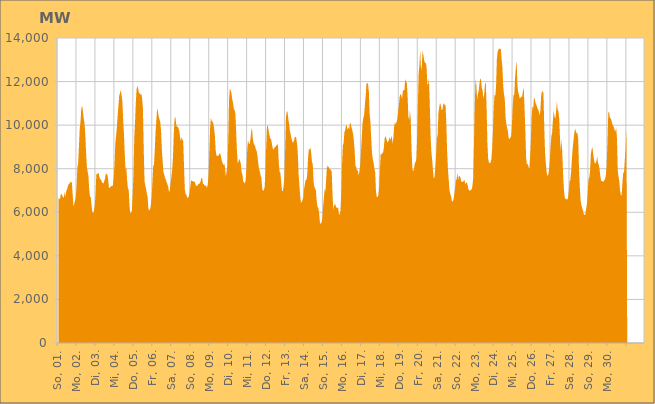
| Category | Series 0 |
|---|---|
|  So, 01.  | 6609.094 |
|  So, 01.  | 6641.879 |
|  So, 01.  | 6589.041 |
|  So, 01.  | 6832.355 |
|  So, 01.  | 6833.887 |
|  So, 01.  | 6762.77 |
|  So, 01.  | 6698.629 |
|  So, 01.  | 6660.672 |
|  So, 01.  | 6949.482 |
|  So, 01.  | 6717.455 |
|  So, 01.  | 6993.082 |
|  So, 01.  | 7049.189 |
|  So, 01.  | 7202.293 |
|  So, 01.  | 7287.182 |
|  So, 01.  | 7312.8 |
|  So, 01.  | 7403.01 |
|  So, 01.  | 7358.183 |
|  Mo, 02.  | 7404.866 |
|  Mo, 02.  | 6848.365 |
|  Mo, 02.  | 6285.724 |
|  Mo, 02.  | 6386.264 |
|  Mo, 02.  | 6525.773 |
|  Mo, 02.  | 6675.253 |
|  Mo, 02.  | 7191.673 |
|  Mo, 02.  | 8045.313 |
|  Mo, 02.  | 8243.904 |
|  Mo, 02.  | 9013.681 |
|  Mo, 02.  | 9832.148 |
|  Mo, 02.  | 10179.757 |
|  Mo, 02.  | 10755.446 |
|  Mo, 02.  | 10888.969 |
|  Mo, 02.  | 10648.476 |
|  Mo, 02.  | 10304.716 |
|  Mo, 02.  | 10105.372 |
|  Mo, 02.  | 9598.46 |
|  Mo, 02.  | 8782.57 |
|  Mo, 02.  | 8084.724 |
|  Mo, 02.  | 7870.404 |
|  Mo, 02.  | 7668.928 |
|  Mo, 02.  | 7055.239 |
|  Mo, 02.  | 6701.512 |
|  Di, 03.  | 6710.743 |
|  Di, 03.  | 6304.086 |
|  Di, 03.  | 5997.291 |
|  Di, 03.  | 5959.956 |
|  Di, 03.  | 6061.653 |
|  Di, 03.  | 6303.941 |
|  Di, 03.  | 6838.596 |
|  Di, 03.  | 7747.436 |
|  Di, 03.  | 7747.659 |
|  Di, 03.  | 7777.552 |
|  Di, 03.  | 7810.3 |
|  Di, 03.  | 7607.157 |
|  Di, 03.  | 7514.668 |
|  Di, 03.  | 7508.314 |
|  Di, 03.  | 7397.384 |
|  Di, 03.  | 7338.894 |
|  Di, 03.  | 7318.414 |
|  Di, 03.  | 7419.01 |
|  Di, 03.  | 7545.15 |
|  Di, 03.  | 7780.058 |
|  Di, 03.  | 7761.892 |
|  Di, 03.  | 7715.73 |
|  Di, 03.  | 7504.461 |
|  Di, 03.  | 7112.614 |
|  Mi, 04.  | 7146.214 |
|  Mi, 04.  | 7159.89 |
|  Mi, 04.  | 7222.329 |
|  Mi, 04.  | 7192.957 |
|  Mi, 04.  | 7249.964 |
|  Mi, 04.  | 7599.159 |
|  Mi, 04.  | 8187.518 |
|  Mi, 04.  | 9152.819 |
|  Mi, 04.  | 9492.616 |
|  Mi, 04.  | 9891.391 |
|  Mi, 04.  | 10433.427 |
|  Mi, 04.  | 10897.175 |
|  Mi, 04.  | 11364.273 |
|  Mi, 04.  | 11476.517 |
|  Mi, 04.  | 11613.148 |
|  Mi, 04.  | 11357.869 |
|  Mi, 04.  | 11064.819 |
|  Mi, 04.  | 10218.077 |
|  Mi, 04.  | 9591.602 |
|  Mi, 04.  | 8676.286 |
|  Mi, 04.  | 7955.344 |
|  Mi, 04.  | 8056.5 |
|  Mi, 04.  | 7460.831 |
|  Mi, 04.  | 7093.16 |
|  Do, 05.  | 7035.402 |
|  Do, 05.  | 6301.559 |
|  Do, 05.  | 5948.114 |
|  Do, 05.  | 5976.624 |
|  Do, 05.  | 6086.227 |
|  Do, 05.  | 6824.893 |
|  Do, 05.  | 7685.257 |
|  Do, 05.  | 9396.837 |
|  Do, 05.  | 10136.279 |
|  Do, 05.  | 11053.049 |
|  Do, 05.  | 11643.505 |
|  Do, 05.  | 11813.227 |
|  Do, 05.  | 11669.072 |
|  Do, 05.  | 11471.2 |
|  Do, 05.  | 11462.873 |
|  Do, 05.  | 11382.948 |
|  Do, 05.  | 11435.166 |
|  Do, 05.  | 11224.291 |
|  Do, 05.  | 10759.338 |
|  Do, 05.  | 8907.942 |
|  Do, 05.  | 7433.535 |
|  Do, 05.  | 7228.24 |
|  Do, 05.  | 7073.832 |
|  Do, 05.  | 6850.962 |
|  Fr, 06.  | 6666.874 |
|  Fr, 06.  | 6133.054 |
|  Fr, 06.  | 6090.807 |
|  Fr, 06.  | 6125.178 |
|  Fr, 06.  | 6318.289 |
|  Fr, 06.  | 6691.272 |
|  Fr, 06.  | 7361.753 |
|  Fr, 06.  | 8127.63 |
|  Fr, 06.  | 8185.358 |
|  Fr, 06.  | 8855.286 |
|  Fr, 06.  | 9684.257 |
|  Fr, 06.  | 10227.416 |
|  Fr, 06.  | 10771.42 |
|  Fr, 06.  | 10629.709 |
|  Fr, 06.  | 10404.634 |
|  Fr, 06.  | 10259.567 |
|  Fr, 06.  | 10127.236 |
|  Fr, 06.  | 9697.392 |
|  Fr, 06.  | 8864.354 |
|  Fr, 06.  | 8331.141 |
|  Fr, 06.  | 7838.08 |
|  Fr, 06.  | 7739.443 |
|  Fr, 06.  | 7568.352 |
|  Fr, 06.  | 7503.322 |
|  Sa, 07.  | 7381.62 |
|  Sa, 07.  | 7279.411 |
|  Sa, 07.  | 7175.44 |
|  Sa, 07.  | 6929.065 |
|  Sa, 07.  | 7002.2 |
|  Sa, 07.  | 7365.982 |
|  Sa, 07.  | 7612.446 |
|  Sa, 07.  | 7934.013 |
|  Sa, 07.  | 8510.626 |
|  Sa, 07.  | 9544.532 |
|  Sa, 07.  | 10298.967 |
|  Sa, 07.  | 10387.305 |
|  Sa, 07.  | 10063.087 |
|  Sa, 07.  | 9922.926 |
|  Sa, 07.  | 9925.384 |
|  Sa, 07.  | 9872.794 |
|  Sa, 07.  | 9739.022 |
|  Sa, 07.  | 9456.034 |
|  Sa, 07.  | 9269.18 |
|  Sa, 07.  | 9448.577 |
|  Sa, 07.  | 9328.712 |
|  Sa, 07.  | 9270.811 |
|  Sa, 07.  | 8142.587 |
|  Sa, 07.  | 7060.627 |
|  So, 08.  | 6831.023 |
|  So, 08.  | 6810.327 |
|  So, 08.  | 6667.015 |
|  So, 08.  | 6669.857 |
|  So, 08.  | 6736.744 |
|  So, 08.  | 6895.374 |
|  So, 08.  | 7193.551 |
|  So, 08.  | 7473.14 |
|  So, 08.  | 7441.878 |
|  So, 08.  | 7426.467 |
|  So, 08.  | 7410.17 |
|  So, 08.  | 7420.375 |
|  So, 08.  | 7345.097 |
|  So, 08.  | 7228.693 |
|  So, 08.  | 7211.187 |
|  So, 08.  | 7218.008 |
|  So, 08.  | 7297.855 |
|  So, 08.  | 7306.649 |
|  So, 08.  | 7327.717 |
|  So, 08.  | 7416.197 |
|  So, 08.  | 7561.046 |
|  So, 08.  | 7579.414 |
|  So, 08.  | 7301.562 |
|  So, 08.  | 7297.466 |
|  Mo, 09.  | 7233.325 |
|  Mo, 09.  | 7213.271 |
|  Mo, 09.  | 7235.511 |
|  Mo, 09.  | 7109.438 |
|  Mo, 09.  | 7267.516 |
|  Mo, 09.  | 7666.855 |
|  Mo, 09.  | 8686.072 |
|  Mo, 09.  | 9841.873 |
|  Mo, 09.  | 10323.79 |
|  Mo, 09.  | 10198.892 |
|  Mo, 09.  | 10171.399 |
|  Mo, 09.  | 10081.609 |
|  Mo, 09.  | 9880.787 |
|  Mo, 09.  | 9549.203 |
|  Mo, 09.  | 8874.469 |
|  Mo, 09.  | 8615.406 |
|  Mo, 09.  | 8582.654 |
|  Mo, 09.  | 8611.158 |
|  Mo, 09.  | 8605.643 |
|  Mo, 09.  | 8708.947 |
|  Mo, 09.  | 8693.62 |
|  Mo, 09.  | 8522.649 |
|  Mo, 09.  | 8348.066 |
|  Mo, 09.  | 8246.385 |
|  Di, 10.  | 8167.295 |
|  Di, 10.  | 8249.138 |
|  Di, 10.  | 8008.505 |
|  Di, 10.  | 7638.507 |
|  Di, 10.  | 7905.795 |
|  Di, 10.  | 8158.52 |
|  Di, 10.  | 9292.214 |
|  Di, 10.  | 11158.01 |
|  Di, 10.  | 11675.636 |
|  Di, 10.  | 11604.006 |
|  Di, 10.  | 11472.156 |
|  Di, 10.  | 11201.858 |
|  Di, 10.  | 11027.963 |
|  Di, 10.  | 10759.568 |
|  Di, 10.  | 10695.582 |
|  Di, 10.  | 10537.319 |
|  Di, 10.  | 9704.477 |
|  Di, 10.  | 8808.77 |
|  Di, 10.  | 8238.538 |
|  Di, 10.  | 8333.451 |
|  Di, 10.  | 8449.541 |
|  Di, 10.  | 8368.532 |
|  Di, 10.  | 8201.718 |
|  Di, 10.  | 7819.59 |
|  Mi, 11.  | 7733.255 |
|  Mi, 11.  | 7388.233 |
|  Mi, 11.  | 7388.447 |
|  Mi, 11.  | 7315.009 |
|  Mi, 11.  | 7468.095 |
|  Mi, 11.  | 7983.67 |
|  Mi, 11.  | 8863.187 |
|  Mi, 11.  | 9308.732 |
|  Mi, 11.  | 9166.52 |
|  Mi, 11.  | 9130.114 |
|  Mi, 11.  | 9317.86 |
|  Mi, 11.  | 9707.588 |
|  Mi, 11.  | 9878.121 |
|  Mi, 11.  | 9402.848 |
|  Mi, 11.  | 9181.781 |
|  Mi, 11.  | 9106.387 |
|  Mi, 11.  | 9024.455 |
|  Mi, 11.  | 8885.106 |
|  Mi, 11.  | 8806.042 |
|  Mi, 11.  | 8591.221 |
|  Mi, 11.  | 8223.411 |
|  Mi, 11.  | 7987.274 |
|  Mi, 11.  | 7868.177 |
|  Mi, 11.  | 7692.864 |
|  Do, 12.  | 7558.308 |
|  Do, 12.  | 7062.089 |
|  Do, 12.  | 6991.603 |
|  Do, 12.  | 7004.928 |
|  Do, 12.  | 7164.059 |
|  Do, 12.  | 7768.196 |
|  Do, 12.  | 8969.397 |
|  Do, 12.  | 9943.696 |
|  Do, 12.  | 9991.874 |
|  Do, 12.  | 9772.303 |
|  Do, 12.  | 9570.866 |
|  Do, 12.  | 9379.636 |
|  Do, 12.  | 9391.888 |
|  Do, 12.  | 9214 |
|  Do, 12.  | 8980.487 |
|  Do, 12.  | 8869.546 |
|  Do, 12.  | 8925.078 |
|  Do, 12.  | 9013.467 |
|  Do, 12.  | 9000.202 |
|  Do, 12.  | 9071.232 |
|  Do, 12.  | 9142.538 |
|  Do, 12.  | 9031.294 |
|  Do, 12.  | 8244.901 |
|  Do, 12.  | 7856.887 |
|  Fr, 13.  | 7810.709 |
|  Fr, 13.  | 7392.71 |
|  Fr, 13.  | 6983.135 |
|  Fr, 13.  | 6962.119 |
|  Fr, 13.  | 7179.709 |
|  Fr, 13.  | 7546.224 |
|  Fr, 13.  | 8861.959 |
|  Fr, 13.  | 10336.063 |
|  Fr, 13.  | 10618.018 |
|  Fr, 13.  | 10624.238 |
|  Fr, 13.  | 10288.395 |
|  Fr, 13.  | 10052.486 |
|  Fr, 13.  | 9745.675 |
|  Fr, 13.  | 9574.057 |
|  Fr, 13.  | 9391.955 |
|  Fr, 13.  | 9259.172 |
|  Fr, 13.  | 9176.535 |
|  Fr, 13.  | 9279.239 |
|  Fr, 13.  | 9423.63 |
|  Fr, 13.  | 9472.029 |
|  Fr, 13.  | 9419.938 |
|  Fr, 13.  | 9159.669 |
|  Fr, 13.  | 8752.281 |
|  Fr, 13.  | 7761.531 |
|  Sa, 14.  | 7258.843 |
|  Sa, 14.  | 6761.795 |
|  Sa, 14.  | 6437.283 |
|  Sa, 14.  | 6471.224 |
|  Sa, 14.  | 6574.562 |
|  Sa, 14.  | 6672.056 |
|  Sa, 14.  | 7082.696 |
|  Sa, 14.  | 7285.042 |
|  Sa, 14.  | 7504.715 |
|  Sa, 14.  | 7481.661 |
|  Sa, 14.  | 7721.218 |
|  Sa, 14.  | 8498.85 |
|  Sa, 14.  | 8900.658 |
|  Sa, 14.  | 8882.47 |
|  Sa, 14.  | 8976.453 |
|  Sa, 14.  | 8699.534 |
|  Sa, 14.  | 8311.743 |
|  Sa, 14.  | 8213.525 |
|  Sa, 14.  | 7401.515 |
|  Sa, 14.  | 7177.583 |
|  Sa, 14.  | 7088.254 |
|  Sa, 14.  | 6995.097 |
|  Sa, 14.  | 6490.657 |
|  Sa, 14.  | 6233.6 |
|  So, 15.  | 6207.485 |
|  So, 15.  | 5969.498 |
|  So, 15.  | 5547.436 |
|  So, 15.  | 5457.16 |
|  So, 15.  | 5541.702 |
|  So, 15.  | 5678.611 |
|  So, 15.  | 6241.343 |
|  So, 15.  | 6652.95 |
|  So, 15.  | 7067.227 |
|  So, 15.  | 6970.18 |
|  So, 15.  | 7526.153 |
|  So, 15.  | 8190.876 |
|  So, 15.  | 8043.724 |
|  So, 15.  | 8099.363 |
|  So, 15.  | 8001.663 |
|  So, 15.  | 7970.38 |
|  So, 15.  | 7938.242 |
|  So, 15.  | 7851.882 |
|  So, 15.  | 6806.599 |
|  So, 15.  | 6114.643 |
|  So, 15.  | 6301.266 |
|  So, 15.  | 6388.752 |
|  So, 15.  | 6301.116 |
|  So, 15.  | 6210.279 |
|  Mo, 16.  | 6195.017 |
|  Mo, 16.  | 6229.172 |
|  Mo, 16.  | 5920.499 |
|  Mo, 16.  | 5895.18 |
|  Mo, 16.  | 6048.652 |
|  Mo, 16.  | 6760.607 |
|  Mo, 16.  | 8157.974 |
|  Mo, 16.  | 9068.661 |
|  Mo, 16.  | 9171.472 |
|  Mo, 16.  | 9676.342 |
|  Mo, 16.  | 9768.978 |
|  Mo, 16.  | 9982.692 |
|  Mo, 16.  | 9993.698 |
|  Mo, 16.  | 9779.546 |
|  Mo, 16.  | 9907.58 |
|  Mo, 16.  | 9816.579 |
|  Mo, 16.  | 10071.717 |
|  Mo, 16.  | 10102.772 |
|  Mo, 16.  | 9889.757 |
|  Mo, 16.  | 9771.211 |
|  Mo, 16.  | 9582.563 |
|  Mo, 16.  | 9293.962 |
|  Mo, 16.  | 8824.165 |
|  Mo, 16.  | 8123.477 |
|  Di, 17.  | 8066.436 |
|  Di, 17.  | 7915.646 |
|  Di, 17.  | 7939.034 |
|  Di, 17.  | 7698.632 |
|  Di, 17.  | 7880.009 |
|  Di, 17.  | 8174.907 |
|  Di, 17.  | 8758.577 |
|  Di, 17.  | 9471.181 |
|  Di, 17.  | 10103.226 |
|  Di, 17.  | 10333.484 |
|  Di, 17.  | 10485.845 |
|  Di, 17.  | 10974.1 |
|  Di, 17.  | 11346.165 |
|  Di, 17.  | 11926.562 |
|  Di, 17.  | 11936.308 |
|  Di, 17.  | 11866.894 |
|  Di, 17.  | 11522.956 |
|  Di, 17.  | 10487.472 |
|  Di, 17.  | 10125.622 |
|  Di, 17.  | 9364.838 |
|  Di, 17.  | 8712.409 |
|  Di, 17.  | 8427.301 |
|  Di, 17.  | 8269.623 |
|  Di, 17.  | 8005.246 |
|  Mi, 18.  | 7835.686 |
|  Mi, 18.  | 6949.849 |
|  Mi, 18.  | 6690.074 |
|  Mi, 18.  | 6709.469 |
|  Mi, 18.  | 6783.211 |
|  Mi, 18.  | 7176.271 |
|  Mi, 18.  | 7975.051 |
|  Mi, 18.  | 8716.062 |
|  Mi, 18.  | 8639.389 |
|  Mi, 18.  | 8729.313 |
|  Mi, 18.  | 8736.289 |
|  Mi, 18.  | 8989.109 |
|  Mi, 18.  | 9398.696 |
|  Mi, 18.  | 9502.296 |
|  Mi, 18.  | 9387.949 |
|  Mi, 18.  | 9261.55 |
|  Mi, 18.  | 9211.473 |
|  Mi, 18.  | 9282.681 |
|  Mi, 18.  | 9449.753 |
|  Mi, 18.  | 9329.629 |
|  Mi, 18.  | 9386.513 |
|  Mi, 18.  | 9517.939 |
|  Mi, 18.  | 9137.433 |
|  Mi, 18.  | 9410.572 |
|  Do, 19.  | 9929.677 |
|  Do, 19.  | 10150.795 |
|  Do, 19.  | 10035.209 |
|  Do, 19.  | 10136.501 |
|  Do, 19.  | 10289.405 |
|  Do, 19.  | 10631.307 |
|  Do, 19.  | 10915.528 |
|  Do, 19.  | 11323.221 |
|  Do, 19.  | 11431.949 |
|  Do, 19.  | 11377.767 |
|  Do, 19.  | 11198.137 |
|  Do, 19.  | 11566.654 |
|  Do, 19.  | 11599.516 |
|  Do, 19.  | 11613.605 |
|  Do, 19.  | 12135.972 |
|  Do, 19.  | 11961.701 |
|  Do, 19.  | 11970.7 |
|  Do, 19.  | 11315.537 |
|  Do, 19.  | 10383.008 |
|  Do, 19.  | 10242.892 |
|  Do, 19.  | 10666.285 |
|  Do, 19.  | 10221.911 |
|  Do, 19.  | 8863.371 |
|  Do, 19.  | 8021.994 |
|  Fr, 20.  | 7876.554 |
|  Fr, 20.  | 7977.381 |
|  Fr, 20.  | 8233.754 |
|  Fr, 20.  | 8303.099 |
|  Fr, 20.  | 8407.374 |
|  Fr, 20.  | 9341.065 |
|  Fr, 20.  | 10946.748 |
|  Fr, 20.  | 12375.062 |
|  Fr, 20.  | 12792.224 |
|  Fr, 20.  | 13458.677 |
|  Fr, 20.  | 12489.154 |
|  Fr, 20.  | 12731.135 |
|  Fr, 20.  | 13424.33 |
|  Fr, 20.  | 13216.304 |
|  Fr, 20.  | 12972.37 |
|  Fr, 20.  | 12851.772 |
|  Fr, 20.  | 12868.901 |
|  Fr, 20.  | 12679.929 |
|  Fr, 20.  | 11866.28 |
|  Fr, 20.  | 11893.3 |
|  Fr, 20.  | 12129.985 |
|  Fr, 20.  | 11095.275 |
|  Fr, 20.  | 9612.098 |
|  Fr, 20.  | 8814.117 |
|  Sa, 21.  | 8437.387 |
|  Sa, 21.  | 8017.58 |
|  Sa, 21.  | 7573.351 |
|  Sa, 21.  | 7584.443 |
|  Sa, 21.  | 7983.874 |
|  Sa, 21.  | 8592.783 |
|  Sa, 21.  | 9380.977 |
|  Sa, 21.  | 9549.116 |
|  Sa, 21.  | 10559.005 |
|  Sa, 21.  | 10807.924 |
|  Sa, 21.  | 11023.003 |
|  Sa, 21.  | 10924.794 |
|  Sa, 21.  | 10691.867 |
|  Sa, 21.  | 10693.4 |
|  Sa, 21.  | 10941.602 |
|  Sa, 21.  | 11009.272 |
|  Sa, 21.  | 10911.249 |
|  Sa, 21.  | 10946.184 |
|  Sa, 21.  | 10132.924 |
|  Sa, 21.  | 8822.573 |
|  Sa, 21.  | 8032.353 |
|  Sa, 21.  | 7511.397 |
|  Sa, 21.  | 7026.47 |
|  Sa, 21.  | 6843.536 |
|  So, 22.  | 6745.909 |
|  So, 22.  | 6519.754 |
|  So, 22.  | 6482.445 |
|  So, 22.  | 6566.977 |
|  So, 22.  | 6805.493 |
|  So, 22.  | 7099.944 |
|  So, 22.  | 7438.801 |
|  So, 22.  | 7507.751 |
|  So, 22.  | 7813.029 |
|  So, 22.  | 7482.61 |
|  So, 22.  | 7684.821 |
|  So, 22.  | 7648.378 |
|  So, 22.  | 7592.36 |
|  So, 22.  | 7405.929 |
|  So, 22.  | 7406.644 |
|  So, 22.  | 7390.672 |
|  So, 22.  | 7441.459 |
|  So, 22.  | 7487.151 |
|  So, 22.  | 7281.994 |
|  So, 22.  | 7350.24 |
|  So, 22.  | 7377.378 |
|  So, 22.  | 7239.6 |
|  So, 22.  | 7060.83 |
|  So, 22.  | 6997.36 |
|  Mo, 23.  | 7002.239 |
|  Mo, 23.  | 7020.847 |
|  Mo, 23.  | 7053.284 |
|  Mo, 23.  | 7199.333 |
|  Mo, 23.  | 7545.997 |
|  Mo, 23.  | 9126.79 |
|  Mo, 23.  | 10884.232 |
|  Mo, 23.  | 12122.323 |
|  Mo, 23.  | 11857.357 |
|  Mo, 23.  | 11189.878 |
|  Mo, 23.  | 11431.494 |
|  Mo, 23.  | 11580.281 |
|  Mo, 23.  | 11917.542 |
|  Mo, 23.  | 12170.136 |
|  Mo, 23.  | 12045.343 |
|  Mo, 23.  | 11694.117 |
|  Mo, 23.  | 11579.67 |
|  Mo, 23.  | 11202.208 |
|  Mo, 23.  | 11440.384 |
|  Mo, 23.  | 11893.033 |
|  Mo, 23.  | 11976.547 |
|  Mo, 23.  | 10824.243 |
|  Mo, 23.  | 9153.313 |
|  Mo, 23.  | 8465.103 |
|  Di, 24.  | 8274.04 |
|  Di, 24.  | 8253.171 |
|  Di, 24.  | 8277.828 |
|  Di, 24.  | 8436.602 |
|  Di, 24.  | 8907.75 |
|  Di, 24.  | 9715.061 |
|  Di, 24.  | 10755.131 |
|  Di, 24.  | 11418.603 |
|  Di, 24.  | 11329.514 |
|  Di, 24.  | 11796.457 |
|  Di, 24.  | 13031.116 |
|  Di, 24.  | 13381.327 |
|  Di, 24.  | 13471.084 |
|  Di, 24.  | 13518.827 |
|  Di, 24.  | 13489.064 |
|  Di, 24.  | 13506.042 |
|  Di, 24.  | 13020.875 |
|  Di, 24.  | 12655.903 |
|  Di, 24.  | 11816.785 |
|  Di, 24.  | 11414.311 |
|  Di, 24.  | 11200.475 |
|  Di, 24.  | 10375.915 |
|  Di, 24.  | 10032.618 |
|  Di, 24.  | 9875.778 |
|  Mi, 25.  | 9713.868 |
|  Mi, 25.  | 9390.06 |
|  Mi, 25.  | 9362.655 |
|  Mi, 25.  | 9433.204 |
|  Mi, 25.  | 9480.527 |
|  Mi, 25.  | 9957.229 |
|  Mi, 25.  | 10843.792 |
|  Mi, 25.  | 11366.656 |
|  Mi, 25.  | 11390.385 |
|  Mi, 25.  | 12128.412 |
|  Mi, 25.  | 12654.897 |
|  Mi, 25.  | 12922.091 |
|  Mi, 25.  | 11857.669 |
|  Mi, 25.  | 11519.289 |
|  Mi, 25.  | 11399.534 |
|  Mi, 25.  | 11211.374 |
|  Mi, 25.  | 11266.501 |
|  Mi, 25.  | 11303.589 |
|  Mi, 25.  | 11305.535 |
|  Mi, 25.  | 11570.276 |
|  Mi, 25.  | 11741.651 |
|  Mi, 25.  | 10813.578 |
|  Mi, 25.  | 9835.878 |
|  Mi, 25.  | 8527.316 |
|  Do, 26.  | 8194.505 |
|  Do, 26.  | 8230.976 |
|  Do, 26.  | 8097.776 |
|  Do, 26.  | 7980.168 |
|  Do, 26.  | 8507.272 |
|  Do, 26.  | 9260.485 |
|  Do, 26.  | 10386.118 |
|  Do, 26.  | 10858.377 |
|  Do, 26.  | 10765.68 |
|  Do, 26.  | 11280.222 |
|  Do, 26.  | 11175.883 |
|  Do, 26.  | 11013.035 |
|  Do, 26.  | 10938.758 |
|  Do, 26.  | 10819.432 |
|  Do, 26.  | 10724.482 |
|  Do, 26.  | 10646.211 |
|  Do, 26.  | 10455.686 |
|  Do, 26.  | 10631.624 |
|  Do, 26.  | 11295.37 |
|  Do, 26.  | 11543.749 |
|  Do, 26.  | 11555.895 |
|  Do, 26.  | 11465.119 |
|  Do, 26.  | 9871.61 |
|  Do, 26.  | 8729.646 |
|  Fr, 27.  | 8244.87 |
|  Fr, 27.  | 7827.83 |
|  Fr, 27.  | 7670.134 |
|  Fr, 27.  | 7715.57 |
|  Fr, 27.  | 7947.254 |
|  Fr, 27.  | 8359.299 |
|  Fr, 27.  | 9035.678 |
|  Fr, 27.  | 9488.991 |
|  Fr, 27.  | 9674.619 |
|  Fr, 27.  | 10260.492 |
|  Fr, 27.  | 10677.892 |
|  Fr, 27.  | 10378.501 |
|  Fr, 27.  | 10291.243 |
|  Fr, 27.  | 10627.912 |
|  Fr, 27.  | 11070.91 |
|  Fr, 27.  | 10705.078 |
|  Fr, 27.  | 10621.704 |
|  Fr, 27.  | 10252.503 |
|  Fr, 27.  | 9289.324 |
|  Fr, 27.  | 8841.812 |
|  Fr, 27.  | 9374.725 |
|  Fr, 27.  | 8533.501 |
|  Fr, 27.  | 7614.052 |
|  Fr, 27.  | 6981.107 |
|  Sa, 28.  | 6652.311 |
|  Sa, 28.  | 6618.245 |
|  Sa, 28.  | 6600.499 |
|  Sa, 28.  | 6582.796 |
|  Sa, 28.  | 6643.099 |
|  Sa, 28.  | 6978.888 |
|  Sa, 28.  | 7432.065 |
|  Sa, 28.  | 7472.652 |
|  Sa, 28.  | 7864.238 |
|  Sa, 28.  | 8441.183 |
|  Sa, 28.  | 8956.858 |
|  Sa, 28.  | 9296.192 |
|  Sa, 28.  | 9644.276 |
|  Sa, 28.  | 9840.68 |
|  Sa, 28.  | 9721.552 |
|  Sa, 28.  | 9611.009 |
|  Sa, 28.  | 9638.537 |
|  Sa, 28.  | 9331.589 |
|  Sa, 28.  | 7972.271 |
|  Sa, 28.  | 7156.561 |
|  Sa, 28.  | 6541.951 |
|  Sa, 28.  | 6330.508 |
|  Sa, 28.  | 6188.779 |
|  Sa, 28.  | 6074.119 |
|  So, 29.  | 5916.077 |
|  So, 29.  | 5876.851 |
|  So, 29.  | 5900.091 |
|  So, 29.  | 6163.393 |
|  So, 29.  | 6392.498 |
|  So, 29.  | 6900.156 |
|  So, 29.  | 7518.447 |
|  So, 29.  | 7601.94 |
|  So, 29.  | 7925.598 |
|  So, 29.  | 8668.22 |
|  So, 29.  | 8898.079 |
|  So, 29.  | 8992.605 |
|  So, 29.  | 8647.48 |
|  So, 29.  | 8406.842 |
|  So, 29.  | 8237.093 |
|  So, 29.  | 8264.445 |
|  So, 29.  | 8342.748 |
|  So, 29.  | 8569.624 |
|  So, 29.  | 8278.189 |
|  So, 29.  | 8178.656 |
|  So, 29.  | 7978.834 |
|  So, 29.  | 7653.217 |
|  So, 29.  | 7442.511 |
|  So, 29.  | 7424.664 |
|  Mo, 30.  | 7420.449 |
|  Mo, 30.  | 7408.909 |
|  Mo, 30.  | 7480.422 |
|  Mo, 30.  | 7535.142 |
|  Mo, 30.  | 7717.521 |
|  Mo, 30.  | 8155.985 |
|  Mo, 30.  | 9210.808 |
|  Mo, 30.  | 10558.806 |
|  Mo, 30.  | 10627.934 |
|  Mo, 30.  | 10355.263 |
|  Mo, 30.  | 10300.378 |
|  Mo, 30.  | 10224.976 |
|  Mo, 30.  | 10066.951 |
|  Mo, 30.  | 9978.043 |
|  Mo, 30.  | 9915.201 |
|  Mo, 30.  | 9771.783 |
|  Mo, 30.  | 9704.301 |
|  Mo, 30.  | 9899.068 |
|  Mo, 30.  | 9399.971 |
|  Mo, 30.  | 7911.174 |
|  Mo, 30.  | 7637.005 |
|  Mo, 30.  | 7412.228 |
|  Mo, 30.  | 6972.755 |
|  Mo, 30.  | 6786.775 |
|  Di, 01.  | 6784.019 |
|  Di, 01.  | 7408.371 |
|  Di, 01.  | 7819.16 |
|  Di, 01.  | 7845.913 |
|  Di, 01.  | 8440.307 |
|  Di, 01.  | 8940.779 |
|    | 9724.954 |
|    | 0 |
|    | 0 |
|    | 0 |
|    | 0 |
|    | 0 |
|    | 0 |
|    | 0 |
|    | 0 |
|    | 0 |
|    | 0 |
|    | 0 |
|    | 0 |
|    | 0 |
|    | 0 |
|    | 0 |
|    | 0 |
|    | 0 |
|    | 0 |
|    | 0 |
|    | 0 |
|    | 0 |
|    | 0 |
|    | 0 |